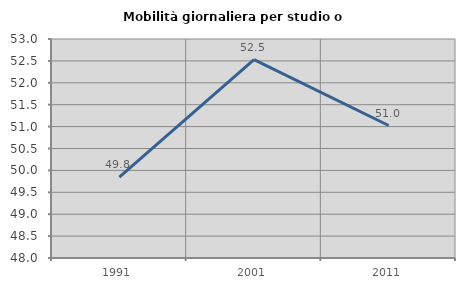
| Category | Mobilità giornaliera per studio o lavoro |
|---|---|
| 1991.0 | 49.844 |
| 2001.0 | 52.527 |
| 2011.0 | 51.025 |